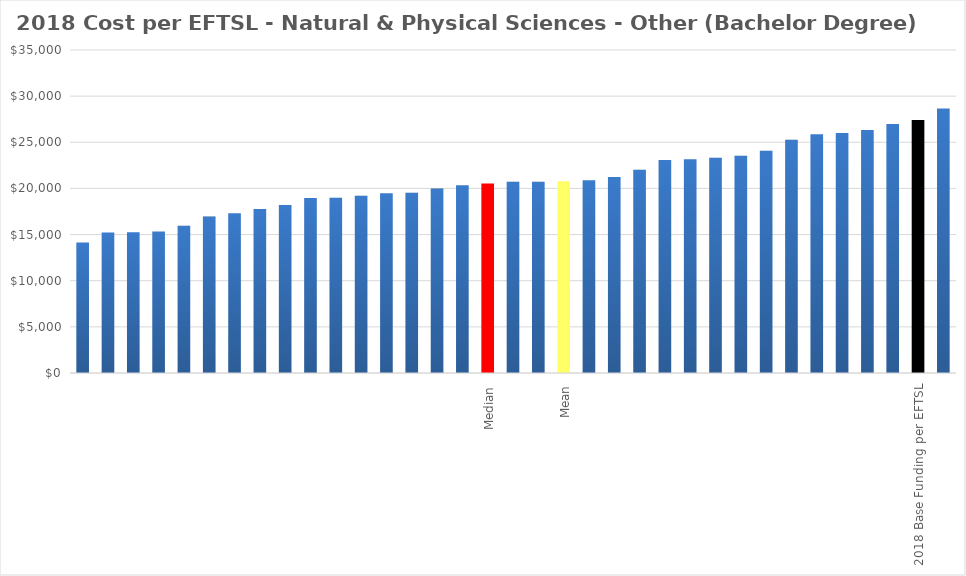
| Category | Series 0 |
|---|---|
|  | 14152.692 |
|  | 15236.941 |
|  | 15246.646 |
|  | 15343.605 |
|  | 15948.185 |
|  | 16946.331 |
|  | 17299.61 |
|  | 17781.617 |
|  | 18199.819 |
|  | 18962.434 |
|  | 18994.024 |
|  | 19202.498 |
|  | 19481.718 |
|  | 19528.702 |
|  | 19979.223 |
|  | 20355.592 |
| Median | 20541.87 |
|  | 20728.148 |
|  | 20729.369 |
| Mean | 20769.536 |
|  | 20894.771 |
|  | 21236.327 |
|  | 22036.909 |
|  | 23072.089 |
|  | 23157.258 |
|  | 23336.264 |
|  | 23540.235 |
|  | 24089.842 |
|  | 25265.549 |
|  | 25873.18 |
|  | 26019.108 |
|  | 26340.581 |
|  | 26978.081 |
| 2018 Base Funding per EFTSL | 27425 |